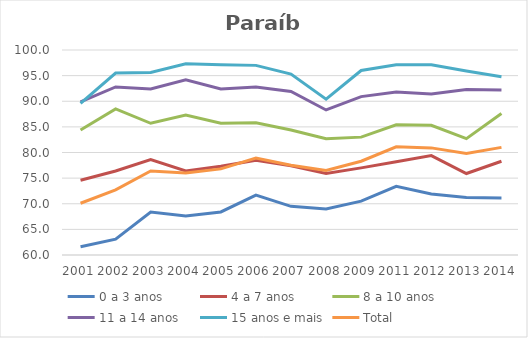
| Category | 0 a 3 anos | 4 a 7 anos | 8 a 10 anos | 11 a 14 anos | 15 anos e mais | Total |
|---|---|---|---|---|---|---|
| 2001.0 | 61.6 | 74.6 | 84.4 | 89.9 | 89.6 | 70.1 |
| 2002.0 | 63.1 | 76.4 | 88.5 | 92.8 | 95.5 | 72.7 |
| 2003.0 | 68.4 | 78.6 | 85.7 | 92.4 | 95.6 | 76.4 |
| 2004.0 | 67.6 | 76.4 | 87.3 | 94.2 | 97.3 | 76 |
| 2005.0 | 68.4 | 77.3 | 85.7 | 92.4 | 97.1 | 76.8 |
| 2006.0 | 71.7 | 78.5 | 85.8 | 92.8 | 97 | 78.9 |
| 2007.0 | 69.5 | 77.4 | 84.4 | 91.9 | 95.3 | 77.5 |
| 2008.0 | 69 | 75.9 | 82.7 | 88.3 | 90.4 | 76.5 |
| 2009.0 | 70.5 | 77 | 83 | 90.9 | 96 | 78.3 |
| 2011.0 | 73.4 | 78.2 | 85.4 | 91.8 | 97.1 | 81.1 |
| 2012.0 | 71.9 | 79.4 | 85.3 | 91.4 | 97.1 | 80.9 |
| 2013.0 | 71.2 | 75.9 | 82.7 | 92.3 | 95.9 | 79.8 |
| 2014.0 | 71.1 | 78.3 | 87.6 | 92.2 | 94.8 | 81 |